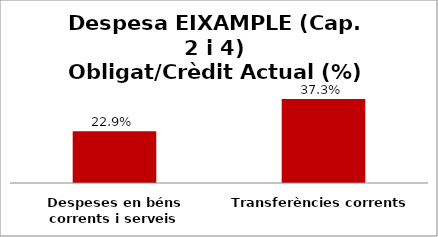
| Category | Series 0 |
|---|---|
| Despeses en béns corrents i serveis | 0.229 |
| Transferències corrents | 0.373 |